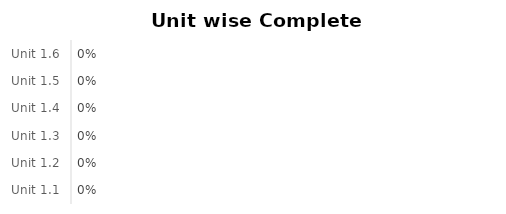
| Category | Complete % |
|---|---|
| Unit 1.1 | 0 |
| Unit 1.2 | 0 |
| Unit 1.3 | 0 |
| Unit 1.4 | 0 |
| Unit 1.5 | 0 |
| Unit 1.6 | 0 |